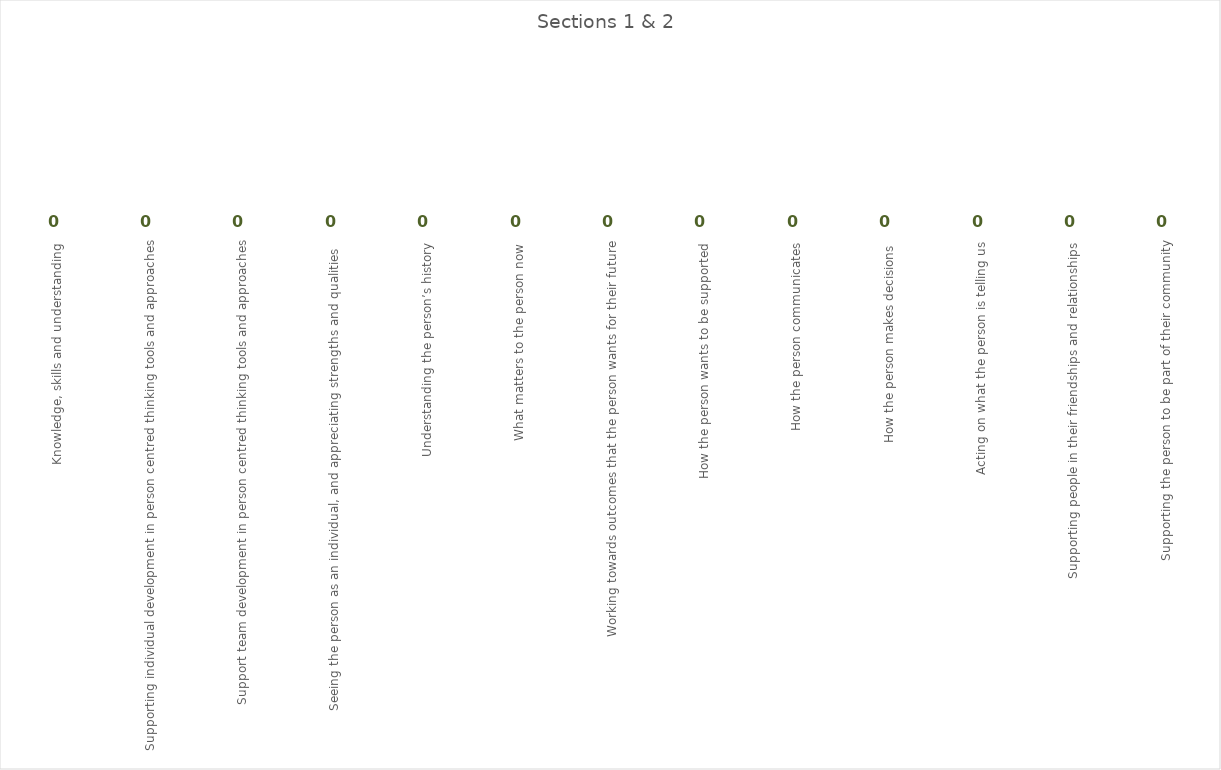
| Category | Series 1 |
|---|---|
| Knowledge, skills and understanding | 0 |
|   Supporting individual development in person centred thinking tools and approaches | 0 |
| Support team development in person centred thinking tools and approaches | 0 |
| Seeing the person as an individual, and appreciating strengths and qualities   | 0 |
| Understanding the person’s history | 0 |
| What matters to the person now | 0 |
| Working towards outcomes that the person wants for their future | 0 |
| How the person wants to be supported | 0 |
| How the person communicates | 0 |
| How the person makes decisions | 0 |
| Acting on what the person is telling us | 0 |
| Supporting people in their friendships and relationships | 0 |
| Supporting the person to be part of their community | 0 |